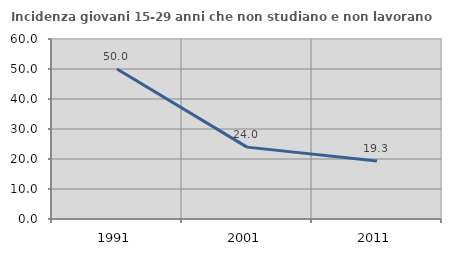
| Category | Incidenza giovani 15-29 anni che non studiano e non lavorano  |
|---|---|
| 1991.0 | 50 |
| 2001.0 | 23.958 |
| 2011.0 | 19.298 |